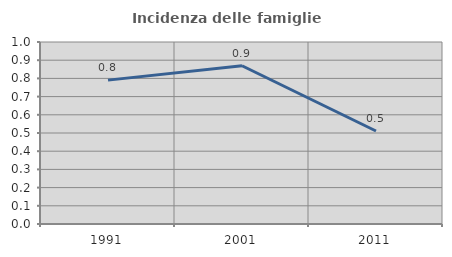
| Category | Incidenza delle famiglie numerose |
|---|---|
| 1991.0 | 0.791 |
| 2001.0 | 0.87 |
| 2011.0 | 0.511 |